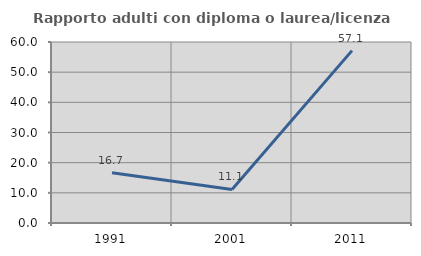
| Category | Rapporto adulti con diploma o laurea/licenza media  |
|---|---|
| 1991.0 | 16.667 |
| 2001.0 | 11.111 |
| 2011.0 | 57.143 |